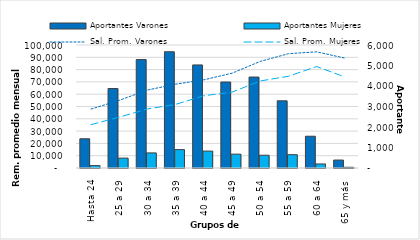
| Category | Aportantes Varones | Aportantes Mujeres |
|---|---|---|
| 0 | 1426 | 118 |
| 1 | 3877 | 483 |
| 2 | 5289 | 736 |
| 3 | 5670 | 897 |
| 4 | 5028 | 826 |
| 5 | 4195 | 676 |
| 6 | 4437 | 623 |
| 7 | 3278 | 650 |
| 8 | 1550 | 198 |
| 9 | 388 | 35 |